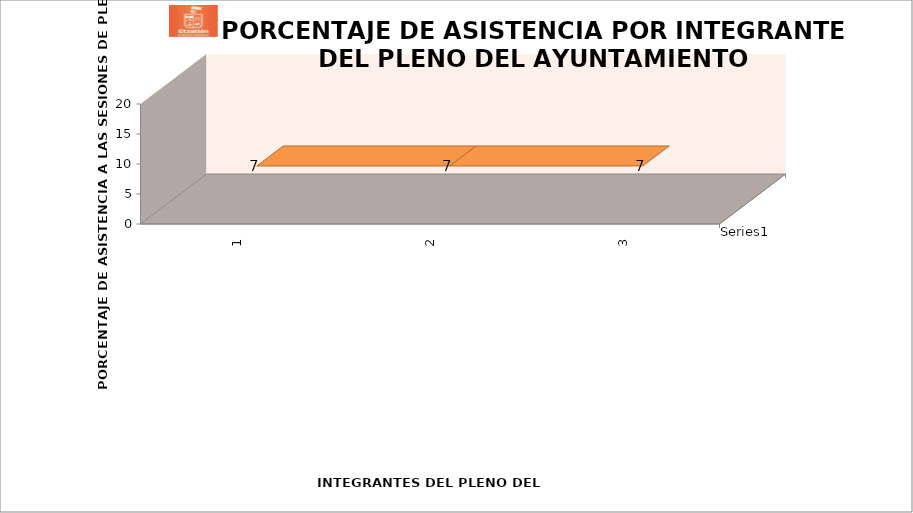
| Category | Series 0 |
|---|---|
| 0 | 7 |
| 1 | 7 |
| 2 | 7 |